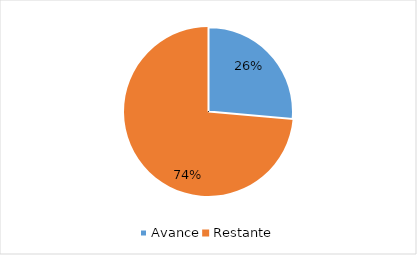
| Category | Series 0 |
|---|---|
| Avance | 0.264 |
| Restante | 0.736 |